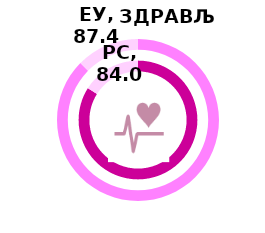
| Category | РС | Series 1 | ЕУ |
|---|---|---|---|
| Index | 84 |  | 87.4 |
| Rest | 16 |  | 12.6 |